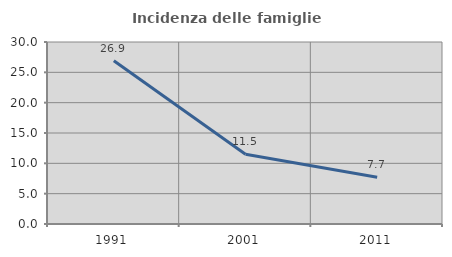
| Category | Incidenza delle famiglie numerose |
|---|---|
| 1991.0 | 26.909 |
| 2001.0 | 11.494 |
| 2011.0 | 7.711 |